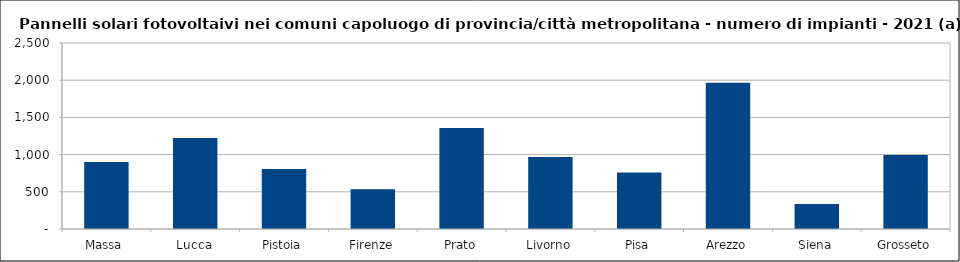
| Category | Series 0 |
|---|---|
| Massa | 902 |
| Lucca | 1224 |
| Pistoia | 808 |
| Firenze | 533 |
| Prato | 1356 |
| Livorno | 968 |
| Pisa | 758 |
| Arezzo | 1967 |
| Siena | 336 |
| Grosseto | 994 |